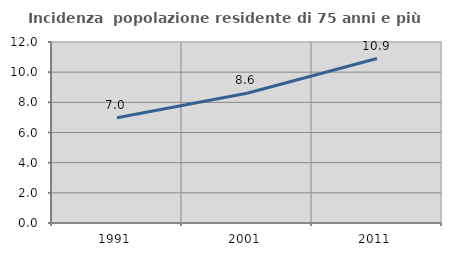
| Category | Incidenza  popolazione residente di 75 anni e più |
|---|---|
| 1991.0 | 6.975 |
| 2001.0 | 8.606 |
| 2011.0 | 10.904 |